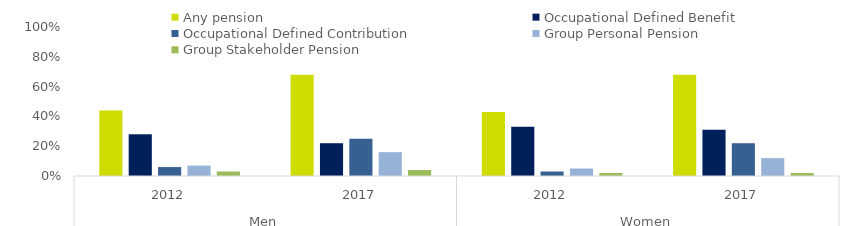
| Category | Any pension | Occupational Defined Benefit | Occupational Defined Contribution | Group Personal Pension | Group Stakeholder Pension |
|---|---|---|---|---|---|
| 0 | 0.44 | 0.28 | 0.06 | 0.07 | 0.03 |
| 1 | 0.68 | 0.22 | 0.25 | 0.16 | 0.04 |
| 2 | 0.43 | 0.33 | 0.03 | 0.05 | 0.02 |
| 3 | 0.68 | 0.31 | 0.22 | 0.12 | 0.02 |